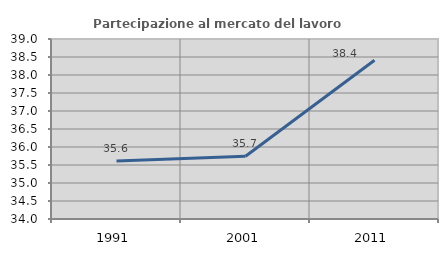
| Category | Partecipazione al mercato del lavoro  femminile |
|---|---|
| 1991.0 | 35.61 |
| 2001.0 | 35.745 |
| 2011.0 | 38.408 |